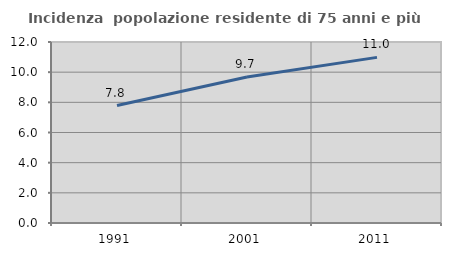
| Category | Incidenza  popolazione residente di 75 anni e più |
|---|---|
| 1991.0 | 7.785 |
| 2001.0 | 9.683 |
| 2011.0 | 10.981 |